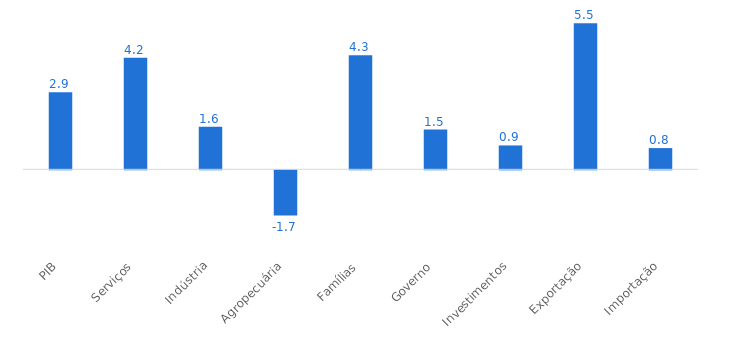
| Category | Variação (%) |
|---|---|
| PIB | 2.9 |
| Serviços | 4.2 |
| Indústria | 1.6 |
| Agropecuária | -1.7 |
| Famílias | 4.3 |
| Governo | 1.5 |
| Investimentos | 0.9 |
| Exportação | 5.5 |
| Importação | 0.8 |